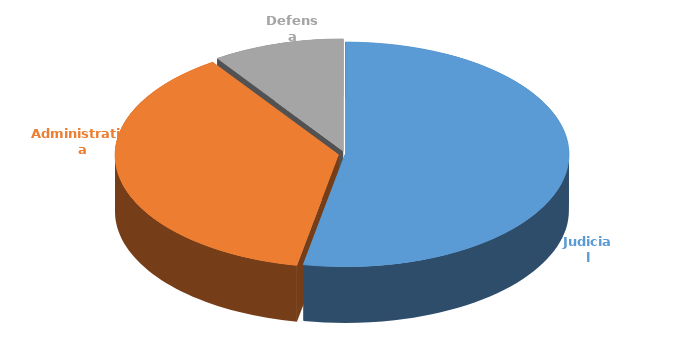
| Category | Cantidad |
|---|---|
| Judicial | 328 |
| Administrativa | 232 |
| Defensa | 59 |